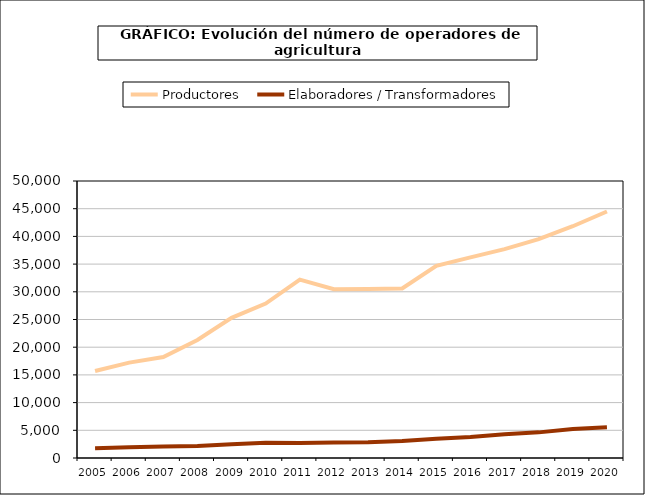
| Category | Productores | Elaboradores / Transformadores |
|---|---|---|
| 2005.0 | 15693 | 1764 |
| 2006.0 | 17214 | 1942 |
| 2007.0 | 18226 | 2061 |
| 2008.0 | 21291 | 2168 |
| 2009.0 | 25291 | 2465 |
| 2010.0 | 27877 | 2747 |
| 2011.0 | 32206 | 2729 |
| 2012.0 | 30462 | 2790 |
| 2013.0 | 30502 | 2842 |
| 2014.0 | 30602 | 3082 |
| 2015.0 | 34673 | 3492 |
| 2016.0 | 36207 | 3810 |
| 2017.0 | 37712 | 4297 |
| 2018.0 | 39505 | 4627 |
| 2019.0 | 41838 | 5230 |
| 2020.0 | 44493 | 5561 |